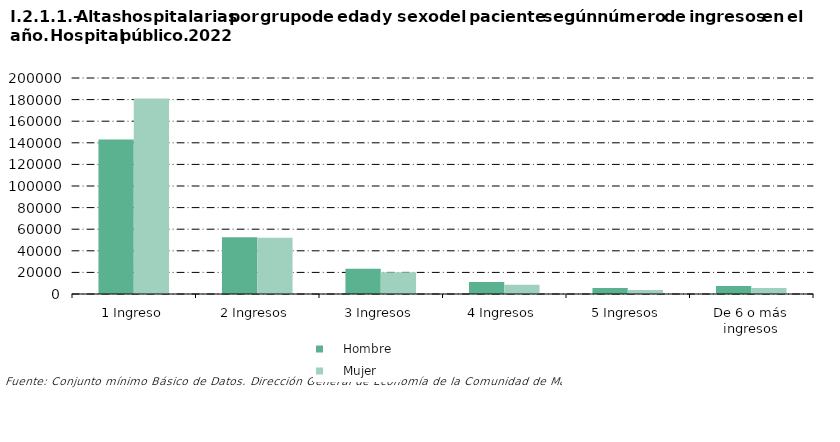
| Category |     Hombre |     Mujer |
|---|---|---|
| 1 Ingreso | 142965 | 180927 |
| 2 Ingresos | 52458 | 52156 |
| 3 Ingresos | 23407 | 20107 |
| 4 Ingresos | 11113 | 8659 |
| 5 Ingresos | 5506 | 3797 |
| De 6 o más ingresos | 7322 | 5447 |